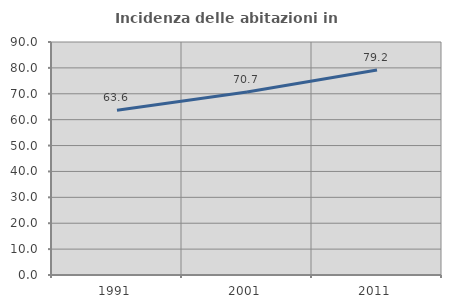
| Category | Incidenza delle abitazioni in proprietà  |
|---|---|
| 1991.0 | 63.636 |
| 2001.0 | 70.652 |
| 2011.0 | 79.208 |